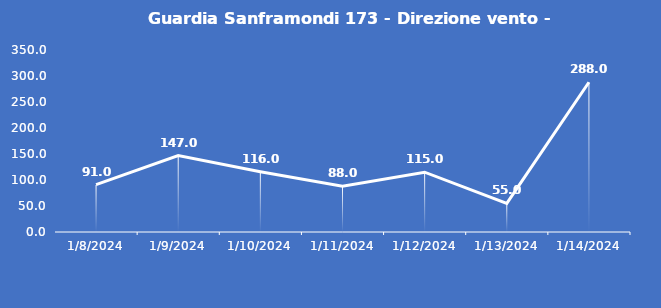
| Category | Guardia Sanframondi 173 - Direzione vento - Grezzo (°N) |
|---|---|
| 1/8/24 | 91 |
| 1/9/24 | 147 |
| 1/10/24 | 116 |
| 1/11/24 | 88 |
| 1/12/24 | 115 |
| 1/13/24 | 55 |
| 1/14/24 | 288 |